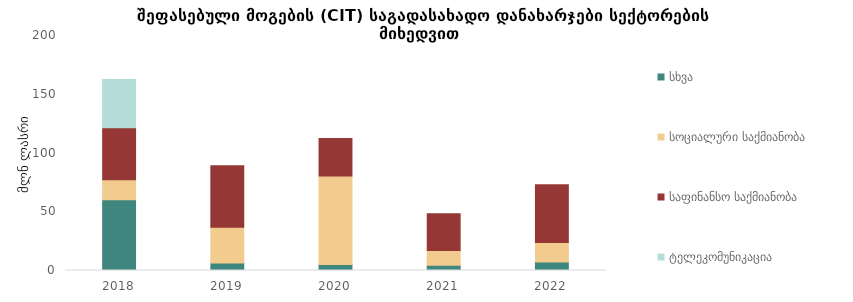
| Category | სხვა | სოციალური საქმიანობა | საფინანსო საქმიანობა | ტელეკომუნიკაცია |
|---|---|---|---|---|
| 2018.0 | 60.3 | 16.96 | 44.31 | 40.89 |
| 2019.0 | 6.35 | 30.45 | 52.28 | 0 |
| 2020.0 | 5.02 | 75.36 | 31.94 | 0 |
| 2021.0 | 4.53 | 12.57 | 31.14 | 0 |
| 2022.0 | 7.14 | 16.63 | 49.22 | 0 |